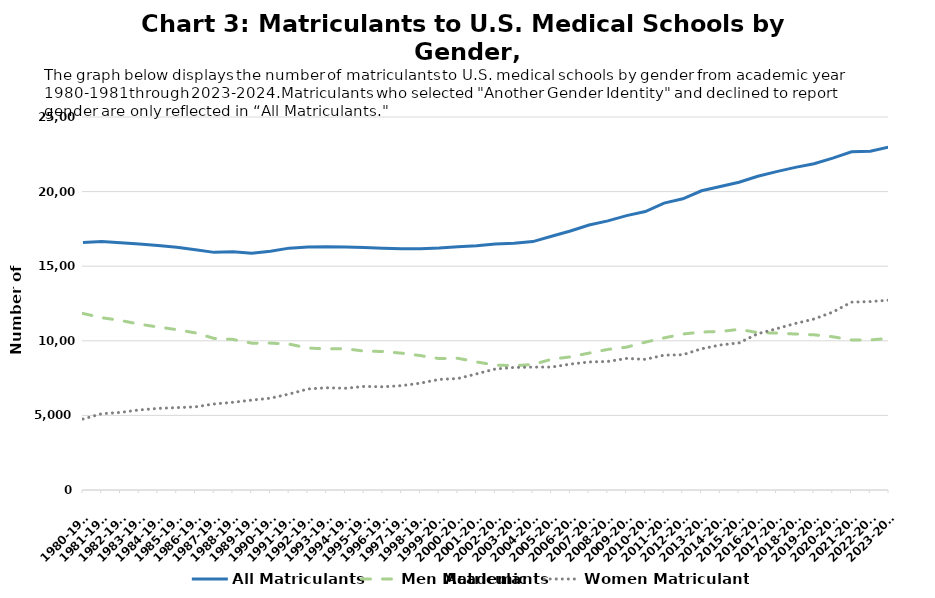
| Category | All Matriculants | Men Matriculants | Women Matriculants |
|---|---|---|---|
| 1980-1981 | 16587 | 11830 | 4757 |
| 1981-1982 | 16660 | 11547 | 5113 |
| 1982-1983 | 16567 | 11366 | 5201 |
| 1983-1984 | 16480 | 11114 | 5366 |
| 1984-1985 | 16395 | 10926 | 5469 |
| 1985-1986 | 16268 | 10748 | 5520 |
| 1986-1987 | 16103 | 10529 | 5574 |
| 1987-1988 | 15927 | 10160 | 5767 |
| 1988-1989 | 15969 | 10091 | 5878 |
| 1989-1990 | 15867 | 9842 | 6025 |
| 1990-1991 | 15998 | 9845 | 6153 |
| 1991-1992 | 16211 | 9778 | 6433 |
| 1992-1993 | 16289 | 9517 | 6772 |
| 1993-1994 | 16307 | 9456 | 6851 |
| 1994-1995 | 16287 | 9468 | 6819 |
| 1995-1996 | 16252 | 9311 | 6941 |
| 1996-1997 | 16201 | 9283 | 6918 |
| 1997-1998 | 16164 | 9170 | 6994 |
| 1998-1999 | 16170 | 9008 | 7162 |
| 1999-2000 | 16221 | 8809 | 7412 |
| 2000-2001 | 16301 | 8829 | 7472 |
| 2001-2002 | 16365 | 8581 | 7784 |
| 2002-2003 | 16488 | 8375 | 8113 |
| 2003-2004 | 16541 | 8329 | 8212 |
| 2004-2005 | 16648 | 8413 | 8235 |
| 2005-2006 | 17003 | 8764 | 8239 |
| 2006-2007 | 17361 | 8923 | 8438 |
| 2007-2008 | 17759 | 9177 | 8582 |
| 2008-2009 | 18036 | 9422 | 8614 |
| 2009-2010 | 18390 | 9573 | 8817 |
| 2010-2011 | 18665 | 9909 | 8756 |
| 2011-2012 | 19230 | 10193 | 9037 |
| 2012-2013 | 19517 | 10453 | 9064 |
| 2013-2014 | 20055 | 10588 | 9467 |
| 2014-2015 | 20343 | 10625 | 9718 |
| 2015-2016 | 20631 | 10766 | 9861 |
| 2016-2017 | 21030 | 10551 | 10474 |
| 2017-2018 | 21338 | 10516 | 10810 |
| 2018-2019 | 21622 | 10454 | 11160 |
| 2019-2020 | 21869 | 10402 | 11461 |
| 2020-2021 | 22239 | 10271 | 11926 |
| 2021-2022 | 22666 | 10057 | 12590 |
| 2022-2023 | 22710 | 10060 | 12630 |
| 2023-2024 | 22981 | 10160 | 12724 |